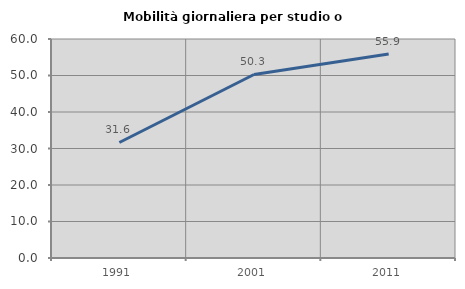
| Category | Mobilità giornaliera per studio o lavoro |
|---|---|
| 1991.0 | 31.644 |
| 2001.0 | 50.277 |
| 2011.0 | 55.881 |